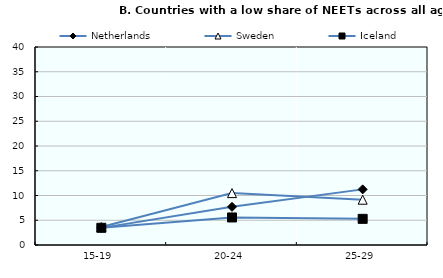
| Category | Netherlands | Sweden | Iceland |
|---|---|---|---|
| 15-19 | 3.461 | 3.632 | 3.473 |
| 20-24 | 7.716 | 10.483 | 5.564 |
| 25-29 | 11.238 | 9.151 | 5.281 |